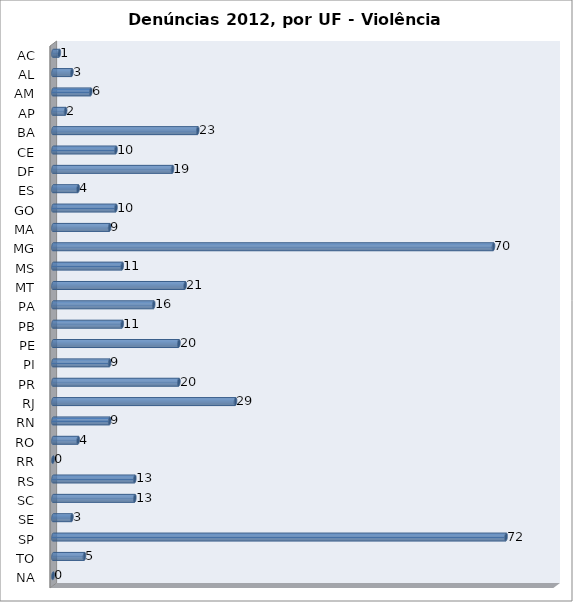
| Category | Series 0 |
|---|---|
| AC | 1 |
| AL | 3 |
| AM | 6 |
| AP | 2 |
| BA | 23 |
| CE | 10 |
| DF | 19 |
| ES | 4 |
| GO | 10 |
| MA | 9 |
| MG | 70 |
| MS | 11 |
| MT | 21 |
| PA | 16 |
| PB | 11 |
| PE | 20 |
| PI | 9 |
| PR | 20 |
| RJ | 29 |
| RN | 9 |
| RO | 4 |
| RR | 0 |
| RS | 13 |
| SC | 13 |
| SE | 3 |
| SP | 72 |
| TO | 5 |
| NA | 0 |